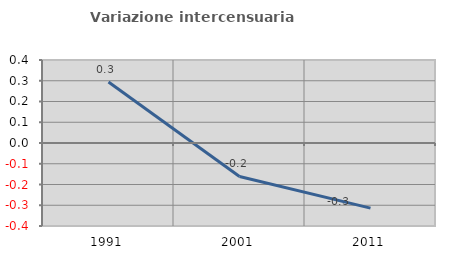
| Category | Variazione intercensuaria annua |
|---|---|
| 1991.0 | 0.294 |
| 2001.0 | -0.161 |
| 2011.0 | -0.314 |